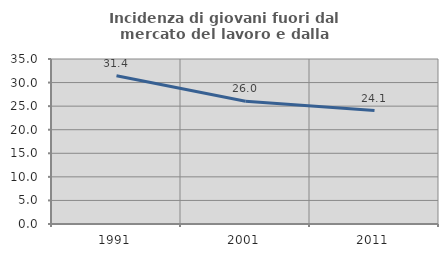
| Category | Incidenza di giovani fuori dal mercato del lavoro e dalla formazione  |
|---|---|
| 1991.0 | 31.434 |
| 2001.0 | 26.049 |
| 2011.0 | 24.074 |